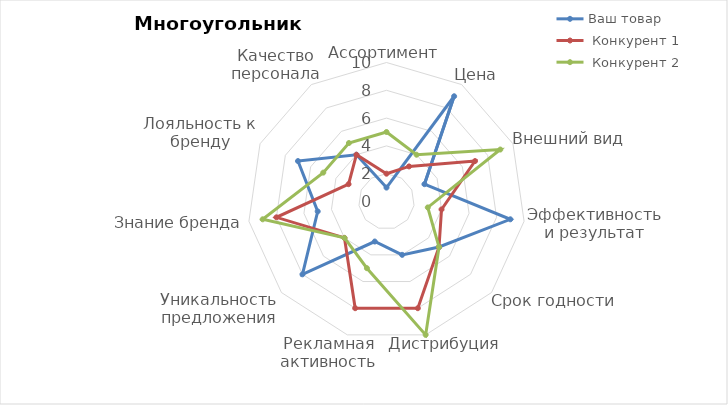
| Category | Ваш товар |  Конкурент 1 |  Конкурент 2 |
|---|---|---|---|
| Ассортимент | 1 | 2 | 5 |
| Цена | 9 | 3 | 4 |
| Внешний вид | 3 | 7 | 9 |
| Эффективность и результат | 9 | 4 | 3 |
| Срок годности | 5 | 5 | 5 |
| Дистрибуция | 4 | 8 | 10 |
| Рекламная активность | 3 | 8 | 5 |
| Уникальность предложения | 8 | 4 | 4 |
| Знание бренда | 5 | 8 | 9 |
| Лояльность к бренду | 7 | 3 | 5 |
| Качество персонала | 4 | 4 | 5 |